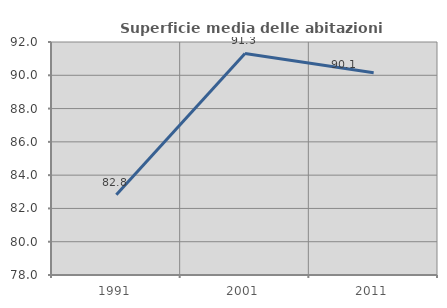
| Category | Superficie media delle abitazioni occupate |
|---|---|
| 1991.0 | 82.822 |
| 2001.0 | 91.312 |
| 2011.0 | 90.147 |